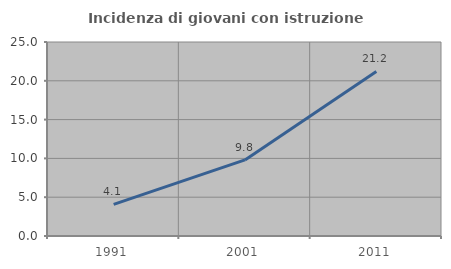
| Category | Incidenza di giovani con istruzione universitaria |
|---|---|
| 1991.0 | 4.082 |
| 2001.0 | 9.804 |
| 2011.0 | 21.212 |